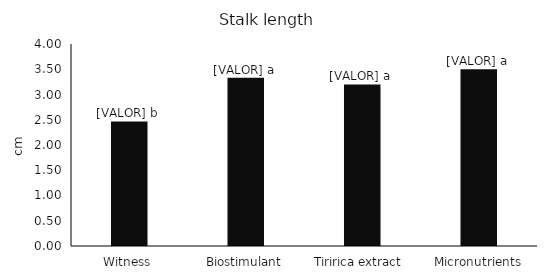
| Category | Series 0 |
|---|---|
| Witness | 2.467 |
| Biostimulant | 3.333 |
| Tiririca extract  | 3.2 |
| Micronutrients | 3.5 |